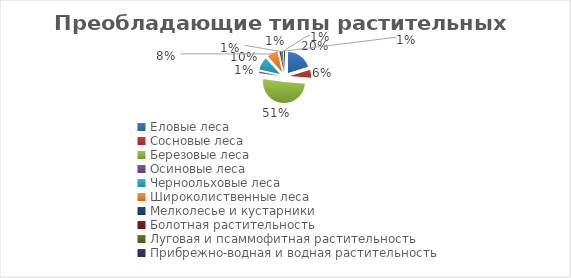
| Category | Series 0 |
|---|---|
| Еловые леса | 20.2 |
| Сосновые леса | 6.1 |
| Березовые леса | 50.9 |
| Осиновые леса | 1.2 |
| Черноольховые леса | 9.9 |
| Широколиственные леса | 8.2 |
| Мелколесье и кустарники | 1 |
| Болотная растительность | 0.5 |
| Луговая и псаммофитная растительность | 1.1 |
| Прибрежно-водная и водная растительность | 0.9 |